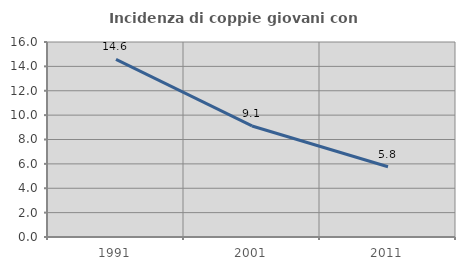
| Category | Incidenza di coppie giovani con figli |
|---|---|
| 1991.0 | 14.577 |
| 2001.0 | 9.11 |
| 2011.0 | 5.762 |